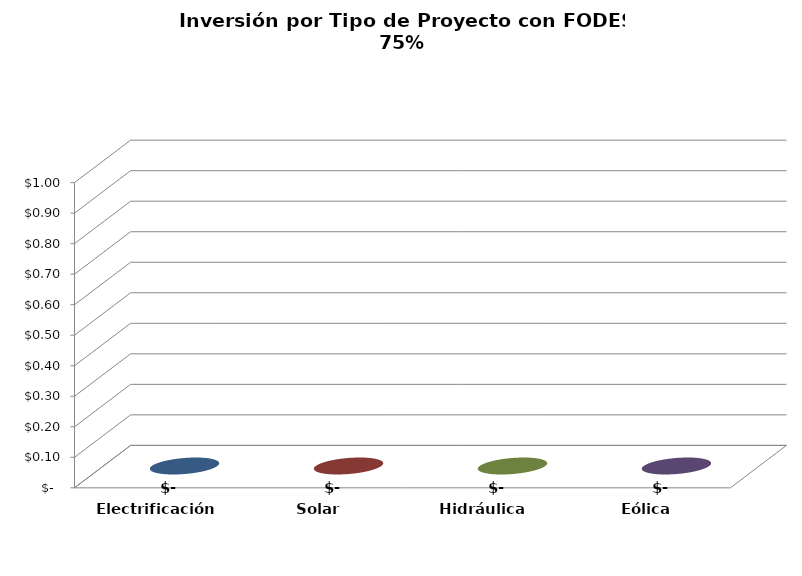
| Category | Series 0 |
|---|---|
| Electrificación  Rural | 0 |
| Solar | 0 |
| Hidráulica | 0 |
| Eólica | 0 |